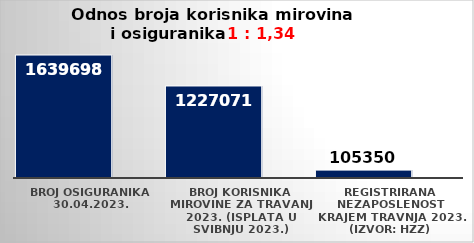
| Category | Series 0 | Series 1 |
|---|---|---|
| Broj osiguranika 30.04.2023. | 1639698 |  |
| Broj korisnika mirovine za travanj 2023. (isplata u svibnju 2023.) | 1227071 |  |
| Registrirana nezaposlenost krajem travnja 2023. (izvor: HZZ) | 105350 |  |